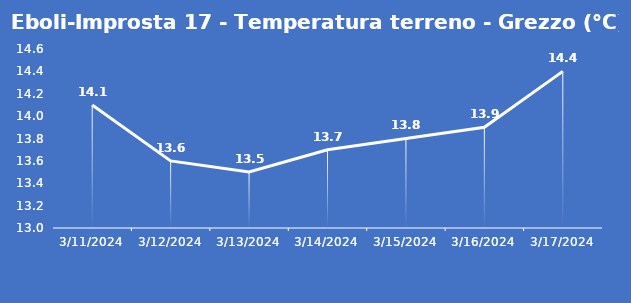
| Category | Eboli-Improsta 17 - Temperatura terreno - Grezzo (°C) |
|---|---|
| 3/11/24 | 14.1 |
| 3/12/24 | 13.6 |
| 3/13/24 | 13.5 |
| 3/14/24 | 13.7 |
| 3/15/24 | 13.8 |
| 3/16/24 | 13.9 |
| 3/17/24 | 14.4 |